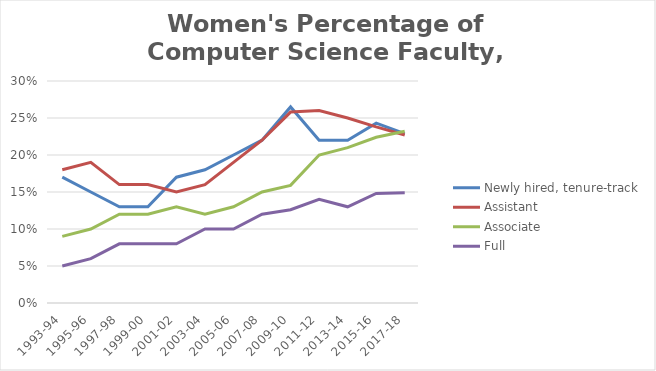
| Category | Newly hired, tenure-track | Assistant | Associate | Full |
|---|---|---|---|---|
| 1993-94 | 0.17 | 0.18 | 0.09 | 0.05 |
| 1995-96 | 0.15 | 0.19 | 0.1 | 0.06 |
| 1997-98 | 0.13 | 0.16 | 0.12 | 0.08 |
| 1999-00 | 0.13 | 0.16 | 0.12 | 0.08 |
| 2001-02 | 0.17 | 0.15 | 0.13 | 0.08 |
| 2003-04 | 0.18 | 0.16 | 0.12 | 0.1 |
| 2005-06 | 0.2 | 0.19 | 0.13 | 0.1 |
| 2007-08 | 0.22 | 0.22 | 0.15 | 0.12 |
| 2009-10 | 0.265 | 0.258 | 0.159 | 0.126 |
| 2011-12 | 0.22 | 0.26 | 0.2 | 0.14 |
| 2013-14 | 0.22 | 0.25 | 0.21 | 0.13 |
| 2015-16 | 0.243 | 0.238 | 0.224 | 0.148 |
| 2017-18 | 0.229 | 0.227 | 0.232 | 0.149 |